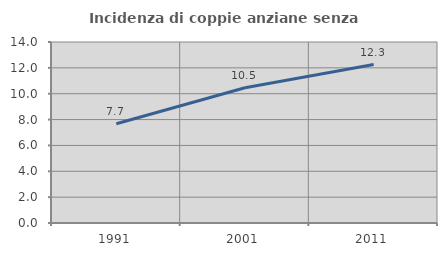
| Category | Incidenza di coppie anziane senza figli  |
|---|---|
| 1991.0 | 7.678 |
| 2001.0 | 10.46 |
| 2011.0 | 12.253 |